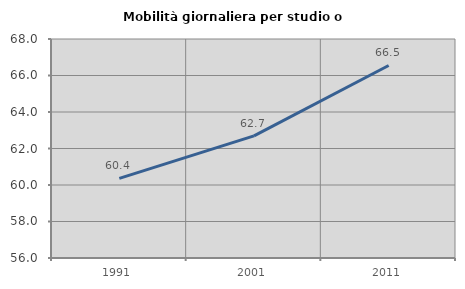
| Category | Mobilità giornaliera per studio o lavoro |
|---|---|
| 1991.0 | 60.365 |
| 2001.0 | 62.69 |
| 2011.0 | 66.548 |